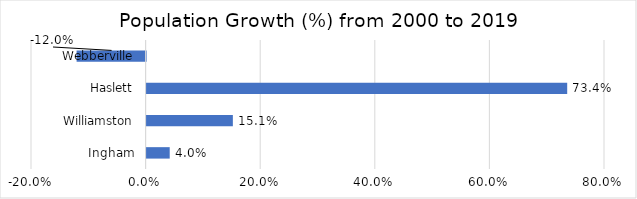
| Category | Growth (%) |
|---|---|
| Ingham | 0.04 |
| Williamston | 0.151 |
| Haslett | 0.734 |
| Webberville | -0.12 |